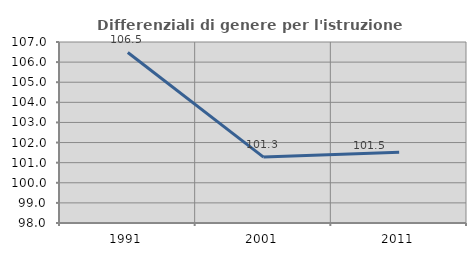
| Category | Differenziali di genere per l'istruzione superiore |
|---|---|
| 1991.0 | 106.48 |
| 2001.0 | 101.279 |
| 2011.0 | 101.518 |